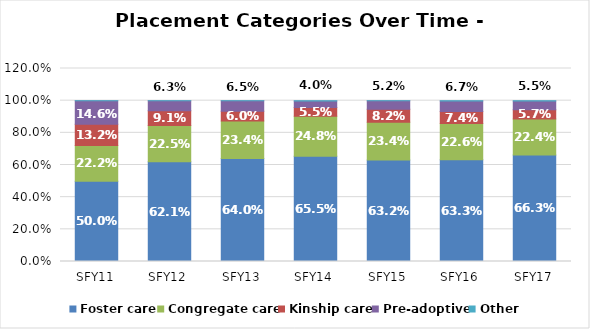
| Category | Foster care | Congregate care | Kinship care | Pre-adoptive | Other |
|---|---|---|---|---|---|
| SFY11 | 0.5 | 0.222 | 0.132 | 0.146 | 0.001 |
| SFY12 | 0.621 | 0.225 | 0.091 | 0.063 | 0.001 |
| SFY13 | 0.64 | 0.234 | 0.06 | 0.065 | 0.001 |
| SFY14 | 0.655 | 0.248 | 0.055 | 0.04 | 0.002 |
| SFY15 | 0.632 | 0.234 | 0.082 | 0.052 | 0.001 |
| SFY16 | 0.633 | 0.226 | 0.074 | 0.067 | 0.001 |
| SFY17 | 0.663 | 0.224 | 0.057 | 0.055 | 0.001 |